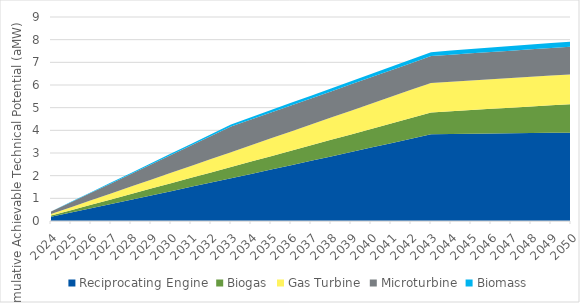
| Category | Reciprocating Engine | Biogas | Gas Turbine | Microturbine | Biomass |
|---|---|---|---|---|---|
| 2024.0 | 0.186 | 0.051 | 0.066 | 0.11 | 0.009 |
| 2025.0 | 0.373 | 0.102 | 0.131 | 0.221 | 0.018 |
| 2026.0 | 0.561 | 0.153 | 0.197 | 0.333 | 0.028 |
| 2027.0 | 0.749 | 0.203 | 0.262 | 0.445 | 0.037 |
| 2028.0 | 0.937 | 0.252 | 0.328 | 0.558 | 0.046 |
| 2029.0 | 1.126 | 0.302 | 0.394 | 0.671 | 0.055 |
| 2030.0 | 1.316 | 0.351 | 0.459 | 0.784 | 0.063 |
| 2031.0 | 1.506 | 0.4 | 0.524 | 0.898 | 0.072 |
| 2032.0 | 1.696 | 0.448 | 0.59 | 1.013 | 0.081 |
| 2033.0 | 1.887 | 0.496 | 0.655 | 1.128 | 0.09 |
| 2034.0 | 2.079 | 0.543 | 0.721 | 1.134 | 0.098 |
| 2035.0 | 2.271 | 0.591 | 0.786 | 1.139 | 0.107 |
| 2036.0 | 2.463 | 0.638 | 0.851 | 1.144 | 0.115 |
| 2037.0 | 2.656 | 0.684 | 0.917 | 1.15 | 0.124 |
| 2038.0 | 2.85 | 0.731 | 0.982 | 1.155 | 0.132 |
| 2039.0 | 3.044 | 0.777 | 1.047 | 1.161 | 0.14 |
| 2040.0 | 3.239 | 0.822 | 1.113 | 1.166 | 0.149 |
| 2041.0 | 3.434 | 0.868 | 1.178 | 1.172 | 0.157 |
| 2042.0 | 3.63 | 0.913 | 1.244 | 1.177 | 0.165 |
| 2043.0 | 3.826 | 0.957 | 1.309 | 1.183 | 0.173 |
| 2044.0 | 3.837 | 1.002 | 1.309 | 1.188 | 0.181 |
| 2045.0 | 3.847 | 1.046 | 1.309 | 1.194 | 0.189 |
| 2046.0 | 3.858 | 1.089 | 1.308 | 1.199 | 0.197 |
| 2047.0 | 3.869 | 1.133 | 1.308 | 1.205 | 0.205 |
| 2048.0 | 3.879 | 1.176 | 1.308 | 1.21 | 0.212 |
| 2049.0 | 3.889 | 1.218 | 1.307 | 1.215 | 0.22 |
| 2050.0 | 3.899 | 1.26 | 1.307 | 1.22 | 0.228 |